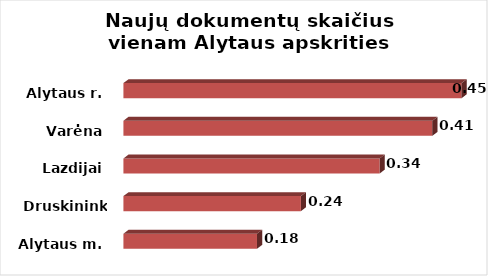
| Category | Series 0 |
|---|---|
| Alytaus m. | 0.177 |
| Druskininkai | 0.235 |
| Lazdijai | 0.34 |
| Varėna | 0.41 |
| Alytaus r. | 0.448 |